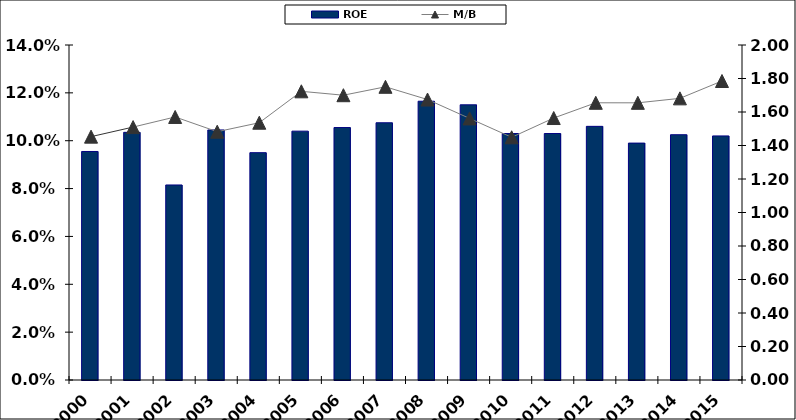
| Category | ROE |
|---|---|
| 2000.0 | 0.096 |
| 2001.0 | 0.104 |
| 2002.0 | 0.082 |
| 2003.0 | 0.105 |
| 2004.0 | 0.095 |
| 2005.0 | 0.104 |
| 2006.0 | 0.106 |
| 2007.0 | 0.108 |
| 2008.0 | 0.116 |
| 2009.0 | 0.115 |
| 2010.0 | 0.103 |
| 2011.0 | 0.103 |
| 2012.0 | 0.106 |
| 2013.0 | 0.099 |
| 2014.0 | 0.103 |
| 2015.0 | 0.102 |